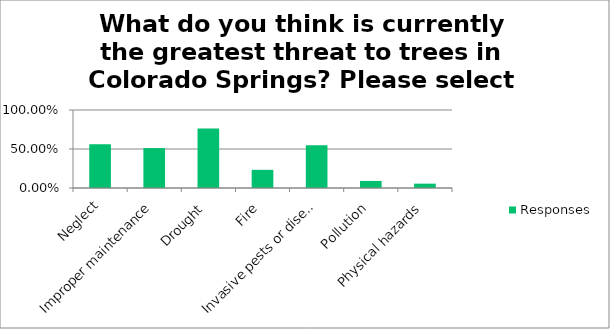
| Category | Responses |
|---|---|
| Neglect | 0.562 |
| Improper maintenance | 0.511 |
| Drought | 0.764 |
| Fire | 0.233 |
| Invasive pests or diseases | 0.548 |
| Pollution | 0.091 |
| Physical hazards | 0.056 |